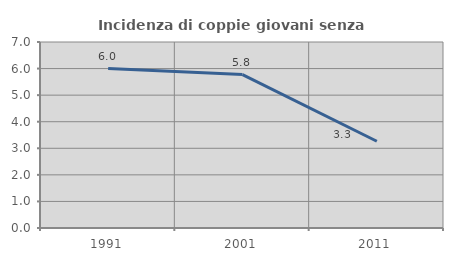
| Category | Incidenza di coppie giovani senza figli |
|---|---|
| 1991.0 | 6 |
| 2001.0 | 5.776 |
| 2011.0 | 3.265 |